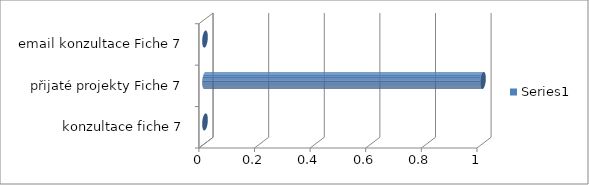
| Category | Series 0 |
|---|---|
| konzultace fiche 7 | 0 |
| přijaté projekty Fiche 7 | 1 |
| email konzultace Fiche 7 | 0 |